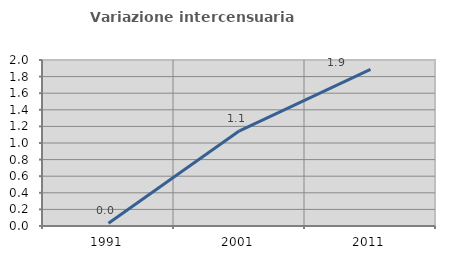
| Category | Variazione intercensuaria annua |
|---|---|
| 1991.0 | 0.033 |
| 2001.0 | 1.147 |
| 2011.0 | 1.887 |